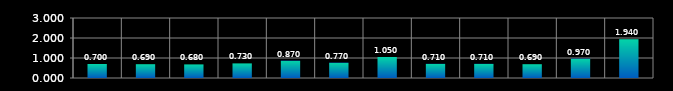
| Category | Series 0 |
|---|---|
| 0 | 0.7 |
| 1 | 0.69 |
| 2 | 0.68 |
| 3 | 0.73 |
| 4 | 0.87 |
| 5 | 0.77 |
| 6 | 1.05 |
| 7 | 0.71 |
| 8 | 0.71 |
| 9 | 0.69 |
| 10 | 0.97 |
| 11 | 1.94 |